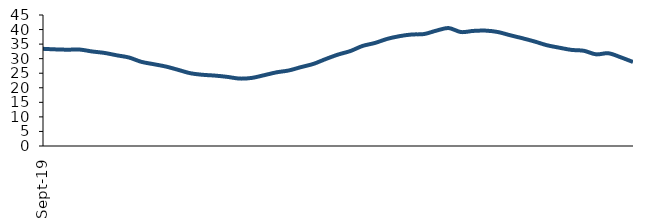
| Category | Series 0 |
|---|---|
| 2019-09-01 | 33.382 |
| 2019-10-01 | 33.194 |
| 2019-11-01 | 33.082 |
| 2019-12-01 | 33.123 |
| 2020-01-01 | 32.469 |
| 2020-02-01 | 31.976 |
| 2020-03-01 | 31.156 |
| 2020-04-01 | 30.392 |
| 2020-05-01 | 28.913 |
| 2020-06-01 | 28.108 |
| 2020-07-01 | 27.29 |
| 2020-08-01 | 26.155 |
| 2020-09-01 | 24.984 |
| 2020-10-01 | 24.457 |
| 2020-11-01 | 24.181 |
| 2020-12-01 | 23.74 |
| 2021-01-01 | 23.158 |
| 2021-02-01 | 23.396 |
| 2021-03-01 | 24.331 |
| 2021-04-01 | 25.306 |
| 2021-05-01 | 25.953 |
| 2021-06-01 | 27.111 |
| 2021-07-01 | 28.2 |
| 2021-08-01 | 29.868 |
| 2021-09-01 | 31.404 |
| 2021-10-01 | 32.611 |
| 2021-11-01 | 34.373 |
| 2021-12-01 | 35.387 |
| 2022-01-01 | 36.784 |
| 2022-02-01 | 37.727 |
| 2022-03-01 | 38.303 |
| 2022-04-01 | 38.455 |
| 2022-05-01 | 39.626 |
| 2022-06-01 | 40.515 |
| 2022-07-01 | 39.14 |
| 2022-08-01 | 39.529 |
| 2022-09-01 | 39.638 |
| 2022-10-01 | 39.158 |
| 2022-11-01 | 38.048 |
| 2022-12-01 | 37.019 |
| 2023-01-01 | 35.89 |
| 2023-02-01 | 34.611 |
| 2023-03-01 | 33.773 |
| 2023-04-01 | 33.011 |
| 2023-05-01 | 32.711 |
| 2023-06-01 | 31.485 |
| 2023-07-01 | 31.855 |
| 2023-08-01 | 30.473 |
| 2023-09-01 | 28.864 |